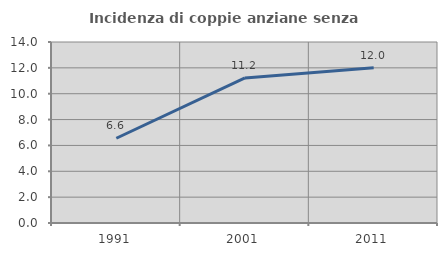
| Category | Incidenza di coppie anziane senza figli  |
|---|---|
| 1991.0 | 6.554 |
| 2001.0 | 11.224 |
| 2011.0 | 12 |